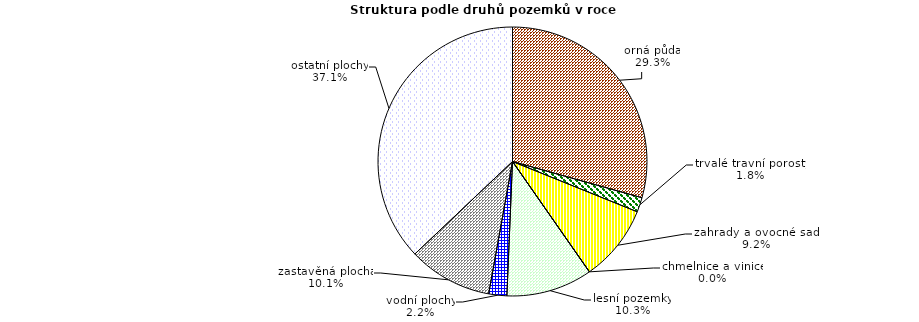
| Category | Struktura druhů pozemků |
|---|---|
| orná půda | 14559 |
| trvalé travní porosty | 869 |
| zahrady a ovocné sady | 4567 |
| chmelnice a vinice | 10 |
| lesní pozemky | 5132 |
| vodní plochy | 1078 |
| zastavěná plocha | 5007 |
| ostatní plochy | 18392 |